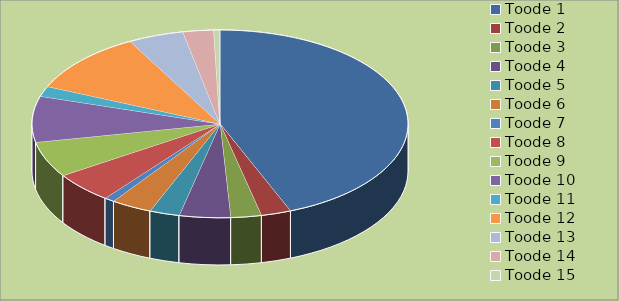
| Category | Series 0 |
|---|---|
| Toode 1 | 5000 |
| Toode 2 | 294 |
| Toode 3 | 300 |
| Toode 4 | 500 |
| Toode 5 | 294 |
| Toode 6 | 400 |
| Toode 7 | 100 |
| Toode 8 | 600 |
| Toode 9 | 700 |
| Toode 10 | 900 |
| Toode 11 | 200 |
| Toode 12 | 1200 |
| Toode 13 | 544 |
| Toode 14 | 300 |
| Toode 15 | 60 |